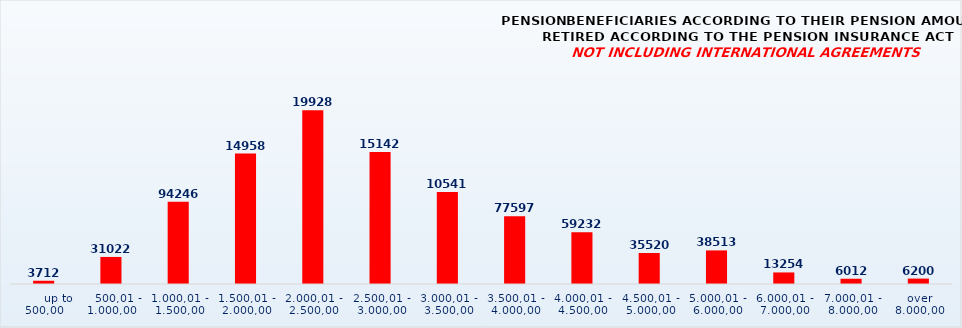
| Category | PENSION BENEFICIARIES ACCORDING TO TYPES AND AMOUNTS OF PENSION, RETIRED ACCORDING TO THE PENSION INSURANCE ACT
NOT INCLUDING INTERNATIONAL AGREEMENTS |
|---|---|
|       up to 500,00 | 3712 |
|    500,01 - 1.000,00 | 31022 |
| 1.000,01 - 1.500,00 | 94246 |
| 1.500,01 - 2.000,00 | 149583 |
| 2.000,01 - 2.500,00 | 199282 |
| 2.500,01 - 3.000,00 | 151423 |
| 3.000,01 - 3.500,00 | 105416 |
| 3.500,01 - 4.000,00 | 77597 |
| 4.000,01 - 4.500,00 | 59232 |
| 4.500,01 - 5.000,00 | 35520 |
| 5.000,01 - 6.000,00 | 38513 |
| 6.000,01 - 7.000,00 | 13254 |
| 7.000,01 - 8.000,00 | 6012 |
|  over  8.000,00 | 6200 |